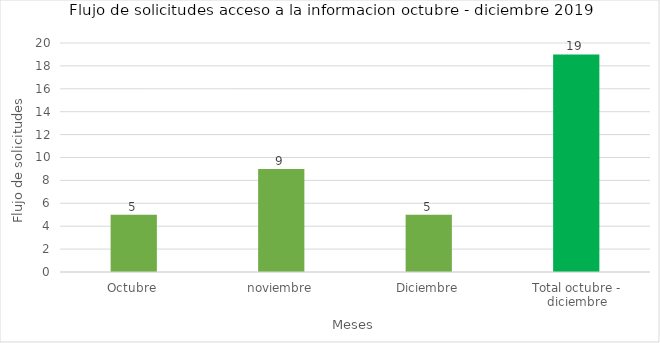
| Category | Flujo de solicitudes |
|---|---|
| Octubre | 5 |
| noviembre | 9 |
| Diciembre | 5 |
| Total octubre - diciembre | 19 |